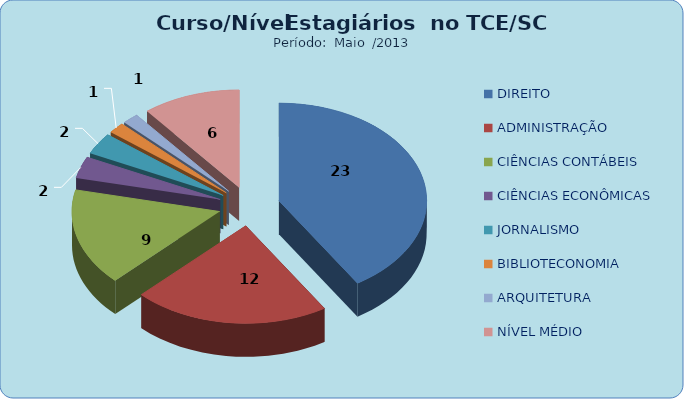
| Category | Series 0 |
|---|---|
| DIREITO | 23 |
| ADMINISTRAÇÃO | 12 |
| CIÊNCIAS CONTÁBEIS | 9 |
| CIÊNCIAS ECONÔMICAS | 2 |
| JORNALISMO | 2 |
| BIBLIOTECONOMIA | 1 |
| ARQUITETURA | 1 |
| NÍVEL MÉDIO | 6 |